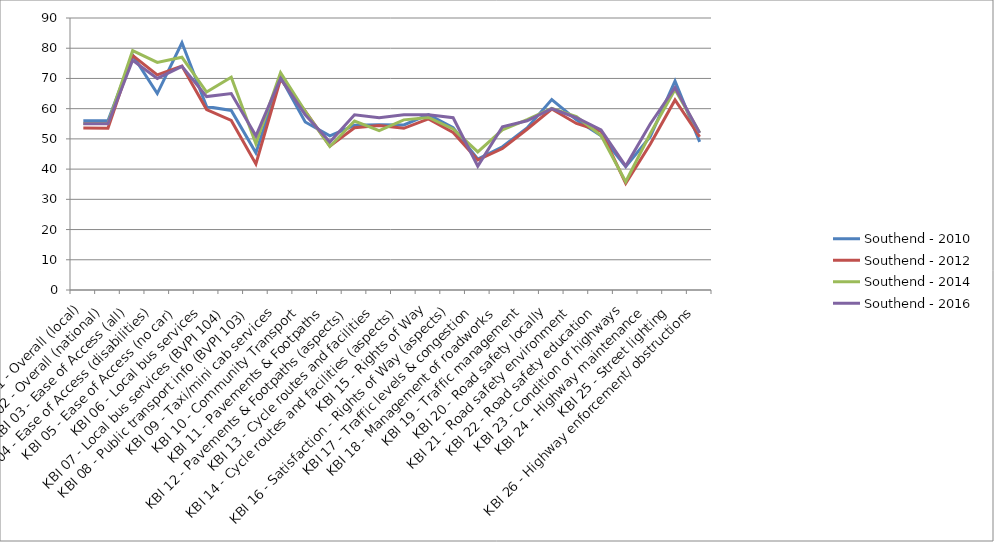
| Category | Southend - 2010 | Southend - 2012 | Southend - 2014 | Southend - 2016 |
|---|---|---|---|---|
| KBI 01 - Overall (local) | 56 | 53.6 | 55.1 | 55 |
| KBI 02 - Overall (national) | 56 | 53.5 | 55.1 | 55 |
| KBI 03 - Ease of Access (all) | 77.7 | 77.6 | 79.2 | 76 |
| KBI 04 - Ease of Access (disabilities) | 65 | 71.2 | 75.3 | 70 |
| KBI 05 - Ease of Access (no car) | 81.8 | 74.1 | 77 | 74 |
| KBI 06 - Local bus services | 60.7 | 59.7 | 65.5 | 64 |
| KBI 07 - Local bus services (BVPI 104) | 59.4 | 56.1 | 70.4 | 65 |
| KBI 08 - Public transport info (BVPI 103) | 45.4 | 41.7 | 48.4 | 51 |
| KBI 09 - Taxi/mini cab services | 70.4 | 69.8 | 71.9 | 70 |
| KBI 10 - Community Transport | 55.6 | 59.2 | 59.1 | 58 |
| KBI 11 - Pavements & Footpaths | 51 | 47.6 | 47.5 | 49 |
| KBI 12 - Pavements & Footpaths (aspects) | 54.5 | 53.7 | 55.9 | 58 |
| KBI 13 - Cycle routes and facilities | 54.7 | 54.4 | 52.7 | 57 |
| KBI 14 - Cycle routes and facilities (aspects) | 54.6 | 53.5 | 56.3 | 58 |
| KBI 15 - Rights of Way | 58 | 56.6 | 57.1 | 58 |
| KBI 16 - Satisfaction - Rights of Way (aspects) | 53.7 | 52.1 | 53.3 | 57 |
| KBI 17 - Traffic levels & congestion | 43.3 | 43 | 45.7 | 41 |
| KBI 18 - Management of roadworks | 47.4 | 46.8 | 53 | 54 |
| KBI 19 - Traffic management | 53.6 | 53.2 | 56.4 | 56 |
| KBI 20 - Road safety locally | 63 | 59.9 | 60.1 | 60 |
| KBI 21 - Road safety environment | 56.3 | 55.1 | 57.4 | 57 |
| KBI 22 - Road safety education | 51 | 52.5 | 51.1 | 53 |
| KBI 23 - Condition of highways | 40.8 | 35.3 | 35.8 | 41 |
| KBI 24 - Highway maintenance | 50.8 | 48.3 | 51.8 | 55 |
| KBI 25 - Street lighting | 69.1 | 62.9 | 66.3 | 67 |
| KBI 26 - Highway enforcement/ obstructions | 49 | 50.7 | 52 | 52 |